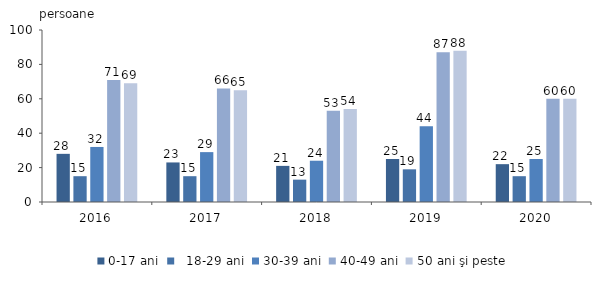
| Category | 0-17 ani |   18-29 ani | 30-39 ani | 40-49 ani | 50 ani şi peste |
|---|---|---|---|---|---|
| 2016.0 | 28 | 15 | 32 | 71 | 69 |
| 2017.0 | 23 | 15 | 29 | 66 | 65 |
| 2018.0 | 21 | 13 | 24 | 53 | 54 |
| 2019.0 | 25 | 19 | 44 | 87 | 88 |
| 2020.0 | 22 | 15 | 25 | 60 | 60 |